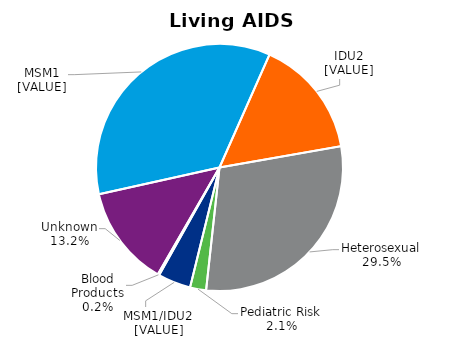
| Category | Living AIDS Cases |
|---|---|
| Unknown | 0.132 |
| MSM | 0.351 |
| IDU | 0.156 |
| Heterosexual | 0.295 |
| Pediatric Risk | 0.021 |
| MSM  /IDU   | 0.043 |
| Blood Products | 0.002 |